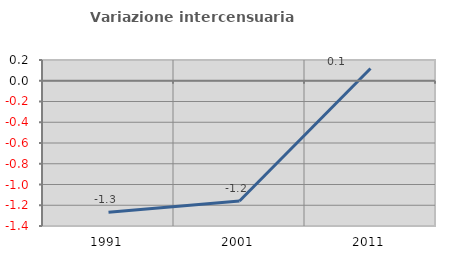
| Category | Variazione intercensuaria annua |
|---|---|
| 1991.0 | -1.267 |
| 2001.0 | -1.158 |
| 2011.0 | 0.118 |